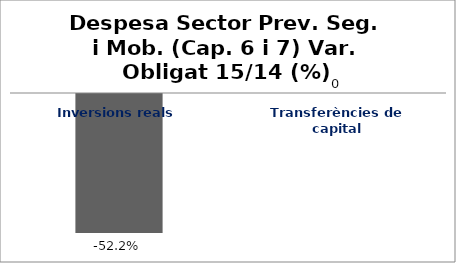
| Category | Series 0 |
|---|---|
| Inversions reals | -0.522 |
| Transferències de capital | 0 |